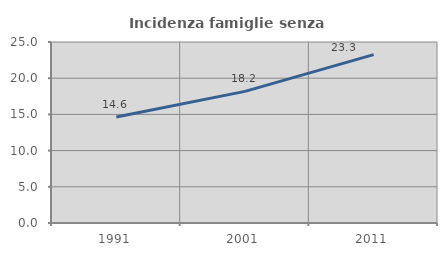
| Category | Incidenza famiglie senza nuclei |
|---|---|
| 1991.0 | 14.648 |
| 2001.0 | 18.178 |
| 2011.0 | 23.256 |